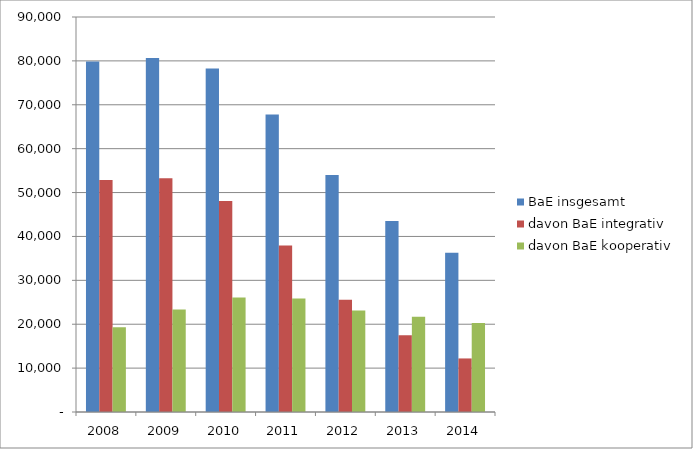
| Category | BaE insgesamt | davon BaE integrativ | davon BaE kooperativ |
|---|---|---|---|
| 2008.0 | 79846 | 52888 | 19329.417 |
| 2009.0 | 80632.417 | 53246.917 | 23382.667 |
| 2010.0 | 78292.333 | 48062.917 | 26091.583 |
| 2011.0 | 67788.583 | 37918.5 | 25855.833 |
| 2012.0 | 54013.083 | 25571.167 | 23143.75 |
| 2013.0 | 43538 | 17509 | 21725.083 |
| 2014.0 | 36286.583 | 12202 | 20276.083 |